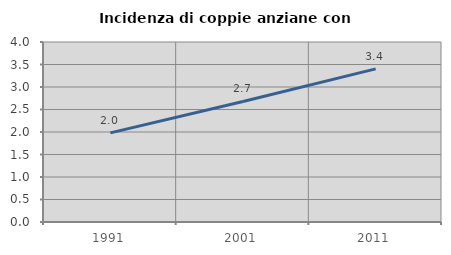
| Category | Incidenza di coppie anziane con figli |
|---|---|
| 1991.0 | 1.981 |
| 2001.0 | 2.678 |
| 2011.0 | 3.402 |